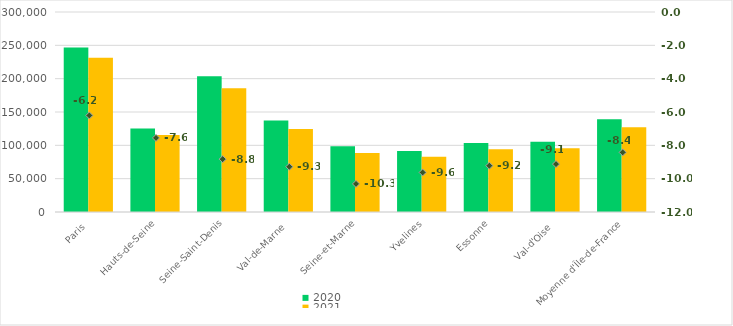
| Category | 2020 | 2021 |
|---|---|---|
| Paris | 246602 | 231294 |
| Hauts-de-Seine | 125090 | 115638 |
| Seine-Saint-Denis | 203787 | 185797 |
| Val-de-Marne | 137266 | 124523 |
| Seine-et-Marne | 98490 | 88331 |
| Yvelines | 91525 | 82715 |
| Essonne | 103525 | 93979 |
| Val-d'Oise | 105223 | 95621 |
| Moyenne d'Île-de-France | 138938.5 | 127237.25 |